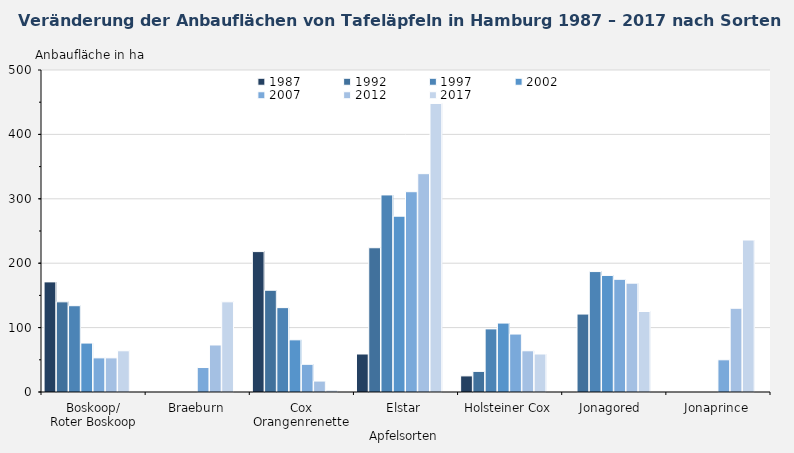
| Category | 1987 | 1992 | 1997 | 2002 | 2007 | 2012 | 2017 | Series 6 |
|---|---|---|---|---|---|---|---|---|
| Boskoop/
Roter Boskoop | 171 | 140 | 134 | 76 | 53 | 53 | 64 |  |
| Braeburn | 0 | 0 | 0 | 0 | 38 | 73 | 140 |  |
| Cox Orangenrenette | 218 | 158 | 131 | 81 | 43 | 17 | 3 |  |
| Elstar | 59 | 224 | 306 | 273 | 311 | 339 | 448 |  |
| Holsteiner Cox | 25 | 32 | 98 | 107 | 90 | 64 | 59 |  |
| Jonagored  | 0 | 121 | 187 | 181 | 175 | 169 | 125 |  |
| Jonaprince | 0 | 0 | 0 | 0 | 50 | 130 | 236 |  |